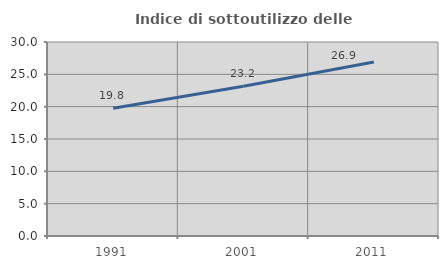
| Category | Indice di sottoutilizzo delle abitazioni  |
|---|---|
| 1991.0 | 19.75 |
| 2001.0 | 23.155 |
| 2011.0 | 26.892 |